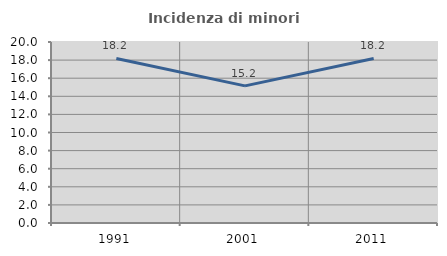
| Category | Incidenza di minori stranieri |
|---|---|
| 1991.0 | 18.182 |
| 2001.0 | 15.152 |
| 2011.0 | 18.182 |